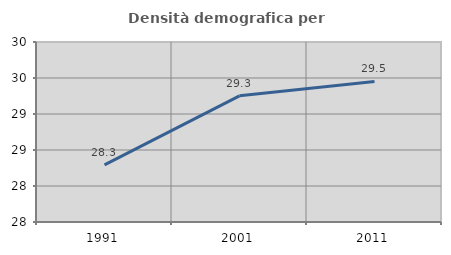
| Category | Densità demografica |
|---|---|
| 1991.0 | 28.293 |
| 2001.0 | 29.252 |
| 2011.0 | 29.452 |